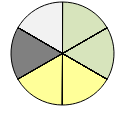
| Category | Series 1 |
|---|---|
| + + | 0 |
| + | 1 |
| o | 0 |
| - | 0 |
| - - | 0 |
| + + | 0 |
| + | 1 |
| o | 0 |
| - | 0 |
| - - | 0 |
| + + | 0 |
| + | 0 |
| o | 1 |
| - | 0 |
| - - | 0 |
| + + | 0 |
| + | 0 |
| o | 1 |
| - | 0 |
| - - | 0 |
| * * | 1 |
| * | 0 |
| o | 0 |
| * * | 0 |
| * | 0 |
| o | 1 |